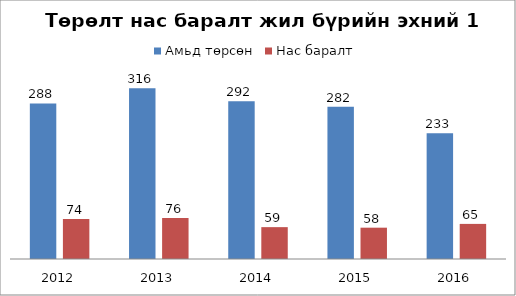
| Category | Амьд төрсөн | Нас баралт |
|---|---|---|
| 2012.0 | 288 | 74 |
| 2013.0 | 316 | 76 |
| 2014.0 | 292 | 59 |
| 2015.0 | 282 | 58 |
| 2016.0 | 233 | 65 |